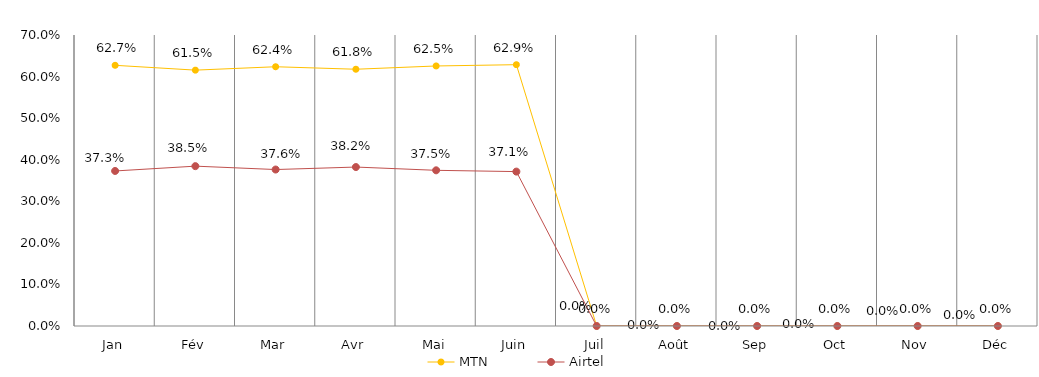
| Category | MTN | Airtel |
|---|---|---|
| Jan | 0.627 | 0.373 |
| Fév | 0.615 | 0.385 |
| Mar | 0.624 | 0.376 |
| Avr | 0.618 | 0.382 |
| Mai | 0.625 | 0.375 |
| Juin | 0.629 | 0.371 |
| Juil | 0 | 0 |
| Août | 0 | 0 |
| Sep | 0 | 0 |
| Oct | 0 | 0 |
| Nov | 0 | 0 |
| Déc | 0 | 0 |